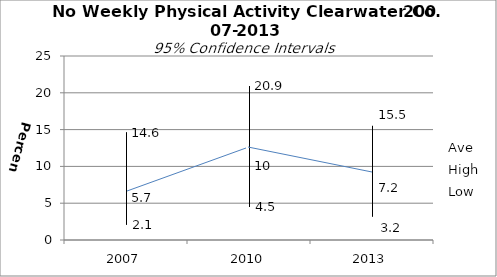
| Category | Ave | High | Low |
|---|---|---|---|
| 2007.0 | 5.7 | 14.6 | 2.1 |
| 2010.0 | 10 | 20.9 | 4.5 |
| 2013.0 | 7.2 | 15.5 | 3.2 |